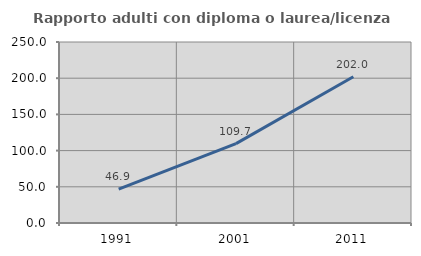
| Category | Rapporto adulti con diploma o laurea/licenza media  |
|---|---|
| 1991.0 | 46.875 |
| 2001.0 | 109.677 |
| 2011.0 | 202.041 |